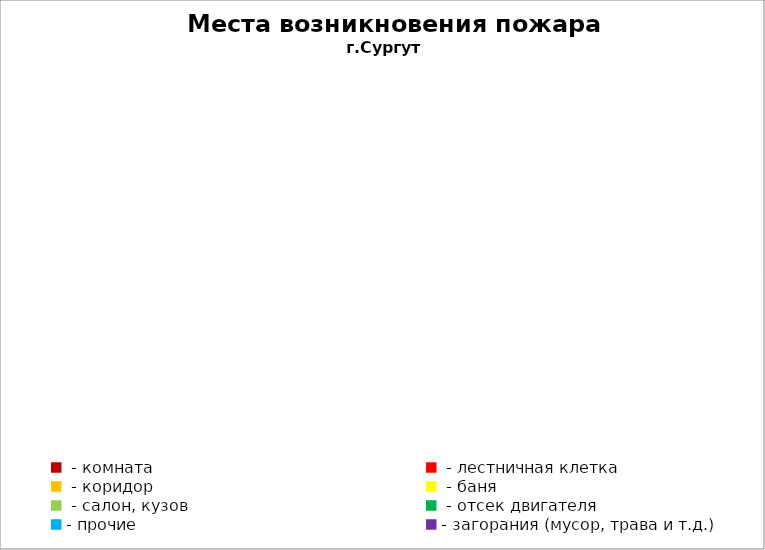
| Category | Места возникновения пожара |
|---|---|
|  - комната | 51 |
|  - лестничная клетка | 23 |
|  - коридор | 4 |
|  - баня | 35 |
|  - салон, кузов | 20 |
|  - отсек двигателя | 25 |
| - прочие | 84 |
| - загорания (мусор, трава и т.д.)  | 158 |